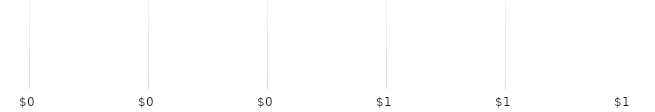
| Category | MONTH TOTALS |
|---|---|
| INCOME | 0 |
| EXPENDITURES | 0 |